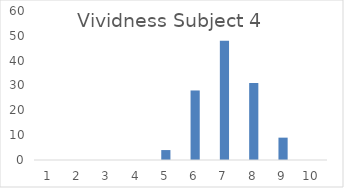
| Category | Series 0 |
|---|---|
| 0 | 0 |
| 1 | 0 |
| 2 | 0 |
| 3 | 0 |
| 4 | 4 |
| 5 | 28 |
| 6 | 48 |
| 7 | 31 |
| 8 | 9 |
| 9 | 0 |